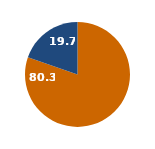
| Category | 2022 |
|---|---|
| Italia | 80.3 |
| Estero | 19.7 |